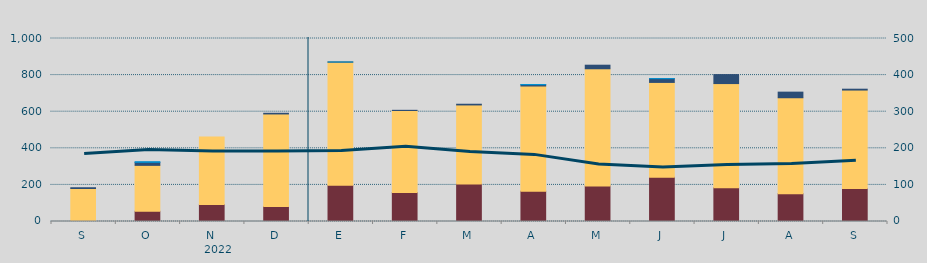
| Category | Carbón | Ciclo Combinado | Cogeneración | Consumo Bombeo | Eólica | Hidráulica | Otras Renovables | Solar fotovoltaica | Solar térmica | Turbinación bombeo | Nuclear |
|---|---|---|---|---|---|---|---|---|---|---|---|
| S | 2508 | 177724.1 | 0 | 4233 | 0 | 0 | 52.5 | 0 | 0 | 0 | 0 |
| O | 55771 | 250950.8 | 0 | 16354.2 | 0 | 3609 | 27 | 0 | 0 | 0 | 0 |
| N | 92910 | 369242.3 | 0 | 0 | 0 | 0 | 0 | 0 | 0 | 0 | 0 |
| D | 82210 | 505508.6 | 0 | 3568.7 | 0 | 0 | 0 | 0 | 0 | 0 | 0 |
| E | 198667 | 672278.9 | 0 | 600 | 0 | 167.2 | 0 | 0 | 0 | 0 | 0 |
| F | 158446.8 | 448230.6 | 0 | 876 | 0 | 0 | 0 | 0 | 0 | 0 | 0 |
| M | 205470 | 431456.4 | 0 | 3844 | 0 | 0 | 0 | 0 | 0 | 0 | 0 |
| A | 165579 | 574881.6 | 0 | 7190 | 0 | 954 | 0 | 0 | 0 | 0 | 0 |
| M | 194640 | 639265.9 | 701 | 19503.3 | 0 | 0 | 0 | 0 | 0 | 0 | 0 |
| J | 241510 | 518484.5 | 0 | 20561.8 | 0 | 350.1 | 0 | 0 | 0 | 0 | 0 |
| J | 184698 | 569012.5 | 0 | 49075.9 | 0 | 0 | 0 | 0 | 0 | 0 | 0 |
| A | 151988 | 524255.8 | 0 | 30631.6 | 0 | 0 | 0 | 0 | 0 | 0 | 0 |
| S | 180894 | 537393.3 | 0 | 4681.3 | 0 | 0 | 0 | 0 | 0 | 0 | 0 |